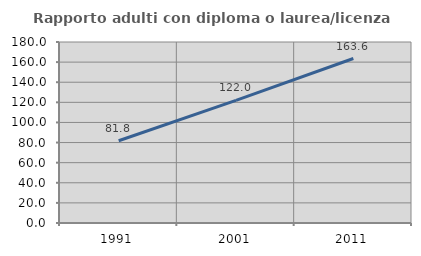
| Category | Rapporto adulti con diploma o laurea/licenza media  |
|---|---|
| 1991.0 | 81.763 |
| 2001.0 | 121.969 |
| 2011.0 | 163.555 |